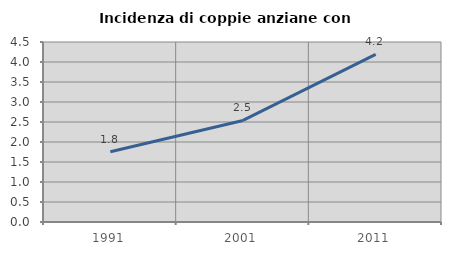
| Category | Incidenza di coppie anziane con figli |
|---|---|
| 1991.0 | 1.756 |
| 2001.0 | 2.539 |
| 2011.0 | 4.189 |